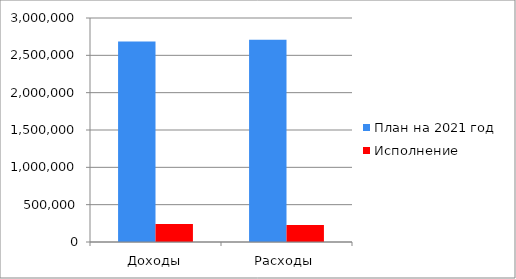
| Category | План на 2021 год | Исполнение |
|---|---|---|
| Доходы | 2686251 | 242394 |
| Расходы | 2710328 | 228271 |